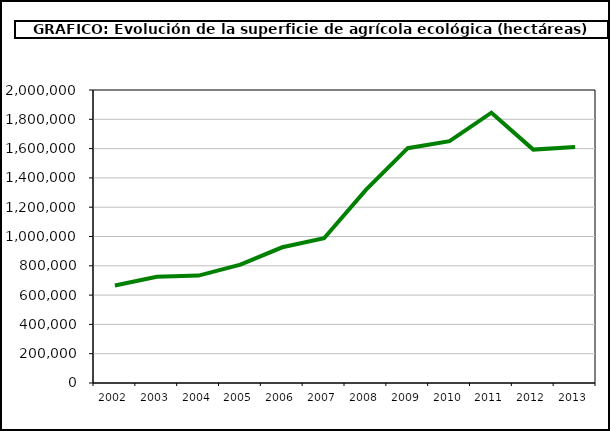
| Category | Superficie (ha) |
|---|---|
| 2002.0 | 665055 |
| 2003.0 | 725254 |
| 2004.0 | 733182 |
| 2005.0 | 807569 |
| 2006.0 | 926390 |
| 2007.0 | 988323 |
| 2008.0 | 1317752 |
| 2009.0 | 1602868 |
| 2010.0 | 1650866 |
| 2011.0 | 1845039 |
| 2012.0 | 1593197 |
| 2013.0 | 1610128.662 |